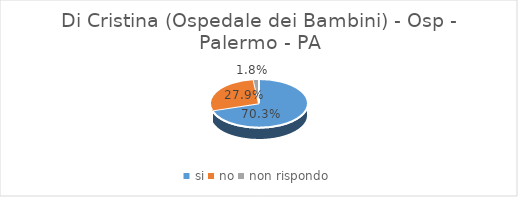
| Category | Di Cristina (Ospedale dei Bambini) - Osp -  Palermo - PA |
|---|---|
| si | 0.703 |
| no | 0.279 |
| non rispondo | 0.018 |